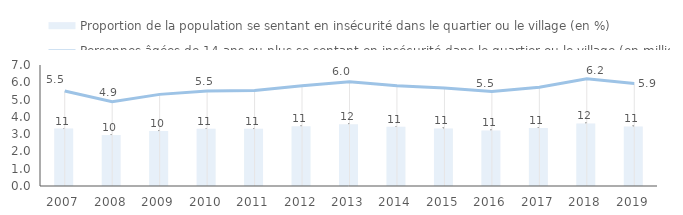
| Category | Proportion de la population se sentant en insécurité dans le quartier ou le village (en %) |
|---|---|
| 2007.0 | 10.91 |
| 2008.0 | 9.68 |
| 2009.0 | 10.44 |
| 2010.0 | 10.88 |
| 2011.0 | 10.86 |
| 2012.0 | 11.36 |
| 2013.0 | 11.75 |
| 2014.0 | 11.24 |
| 2015.0 | 10.94 |
| 2016.0 | 10.57 |
| 2017.0 | 11.02 |
| 2018.0 | 11.9 |
| 2019.0 | 11.312 |